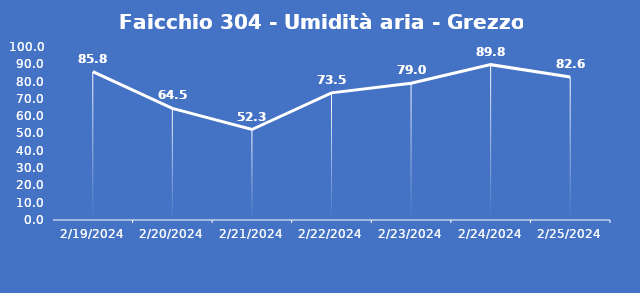
| Category | Faicchio 304 - Umidità aria - Grezzo (%) |
|---|---|
| 2/19/24 | 85.8 |
| 2/20/24 | 64.5 |
| 2/21/24 | 52.3 |
| 2/22/24 | 73.5 |
| 2/23/24 | 79 |
| 2/24/24 | 89.8 |
| 2/25/24 | 82.6 |